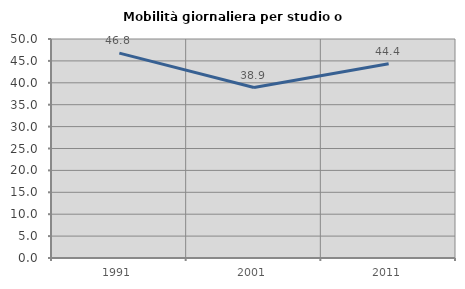
| Category | Mobilità giornaliera per studio o lavoro |
|---|---|
| 1991.0 | 46.769 |
| 2001.0 | 38.922 |
| 2011.0 | 44.352 |